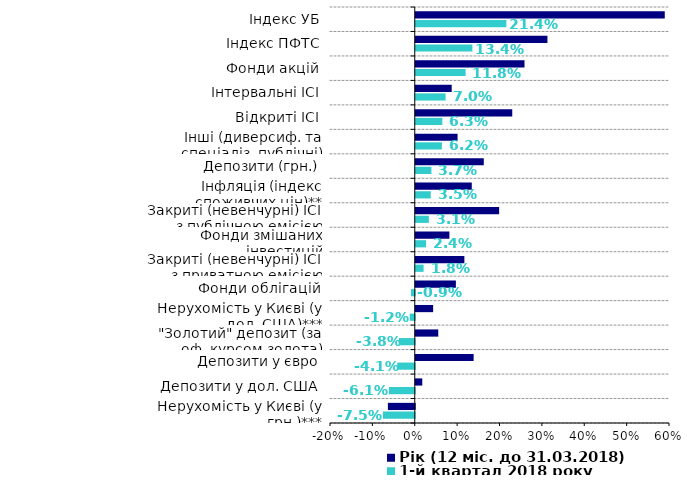
| Category | 1-й квартал 2018 року | Рік (12 міс. до 31.03.2018) |
|---|---|---|
| Нерухомість у Києві (у грн.)*** | -0.075 | -0.063 |
| Депозити у дол. США | -0.061 | 0.015 |
| Депозити у євро | -0.041 | 0.137 |
| "Золотий" депозит (за оф. курсом золота) | -0.038 | 0.053 |
| Нерухомість у Києві (у дол. США)*** | -0.012 | 0.041 |
| Фонди облігацій | -0.009 | 0.095 |
| Закриті (невенчурні) ІСІ з приватною емісією | 0.018 | 0.115 |
| Фонди змішаних інвестицій | 0.024 | 0.079 |
| Закриті (невенчурні) ІСІ з публічною емісією | 0.031 | 0.197 |
| Інфляція (індекс споживчих цін)** | 0.035 | 0.132 |
| Депозити (грн.) | 0.037 | 0.161 |
| Інші (диверсиф. та спеціаліз. публічні) фонди | 0.062 | 0.099 |
| Відкриті ІСІ | 0.063 | 0.228 |
| Інтервальні ІСІ | 0.07 | 0.085 |
| Фонди акцій | 0.118 | 0.257 |
| Індекс ПФТС | 0.134 | 0.311 |
| Індекс УБ | 0.214 | 0.588 |